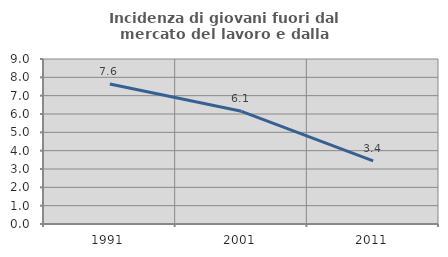
| Category | Incidenza di giovani fuori dal mercato del lavoro e dalla formazione  |
|---|---|
| 1991.0 | 7.639 |
| 2001.0 | 6.145 |
| 2011.0 | 3.448 |